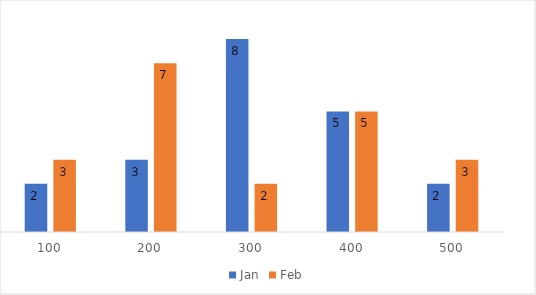
| Category | Jan | Feb |
|---|---|---|
| 100.0 | 2 | 3 |
| 200.0 | 3 | 7 |
| 300.0 | 8 | 2 |
| 400.0 | 5 | 5 |
| 500.0 | 2 | 3 |